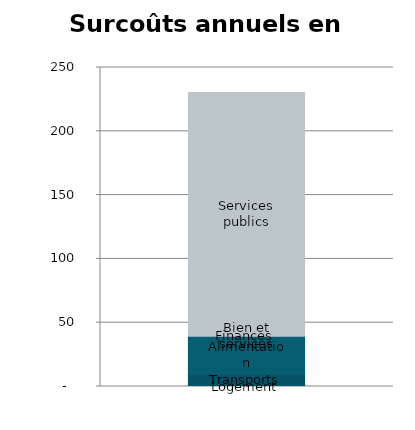
| Category | Logement | Transports | Alimentation | Bien et services | Finances | Services publics |
|---|---|---|---|---|---|---|
| 0 | 0 | 9.88 | 29.404 | 0 | 0 | 191.129 |